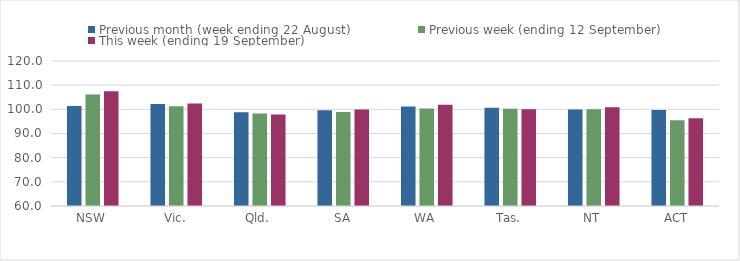
| Category | Previous month (week ending 22 August) | Previous week (ending 12 September) | This week (ending 19 September) |
|---|---|---|---|
| NSW | 101.41 | 106.16 | 107.5 |
| Vic. | 102.19 | 101.29 | 102.46 |
| Qld. | 98.81 | 98.29 | 97.82 |
| SA | 99.61 | 98.88 | 99.91 |
| WA | 101.14 | 100.32 | 101.86 |
| Tas. | 100.65 | 100.25 | 100 |
| NT | 99.91 | 100 | 100.87 |
| ACT | 99.68 | 95.46 | 96.3 |